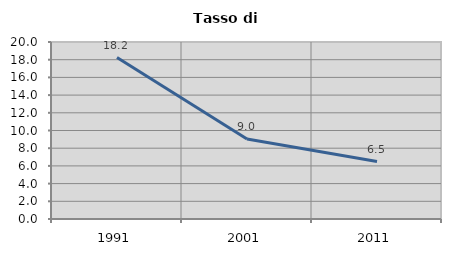
| Category | Tasso di disoccupazione   |
|---|---|
| 1991.0 | 18.244 |
| 2001.0 | 9.031 |
| 2011.0 | 6.489 |